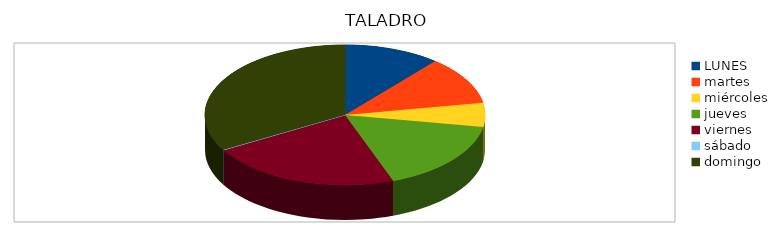
| Category | Series 0 |
|---|---|
| LUNES | 4500 |
| martes | 4500 |
| miércoles | 2250 |
| jueves | 6750 |
| viernes | 9000 |
| sábado | 0 |
| domingo | 13500 |